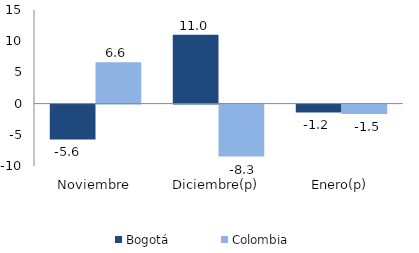
| Category | Bogotá | Colombia |
|---|---|---|
| Noviembre | -5.576 | 6.609 |
| Diciembre(p) | 11.044 | -8.331 |
| Enero(p) | -1.249 | -1.513 |